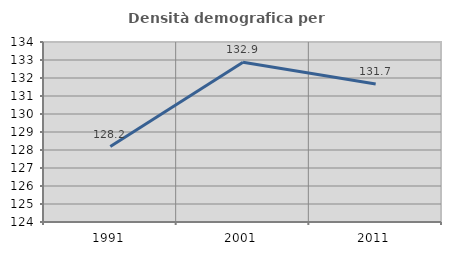
| Category | Densità demografica |
|---|---|
| 1991.0 | 128.192 |
| 2001.0 | 132.881 |
| 2011.0 | 131.662 |